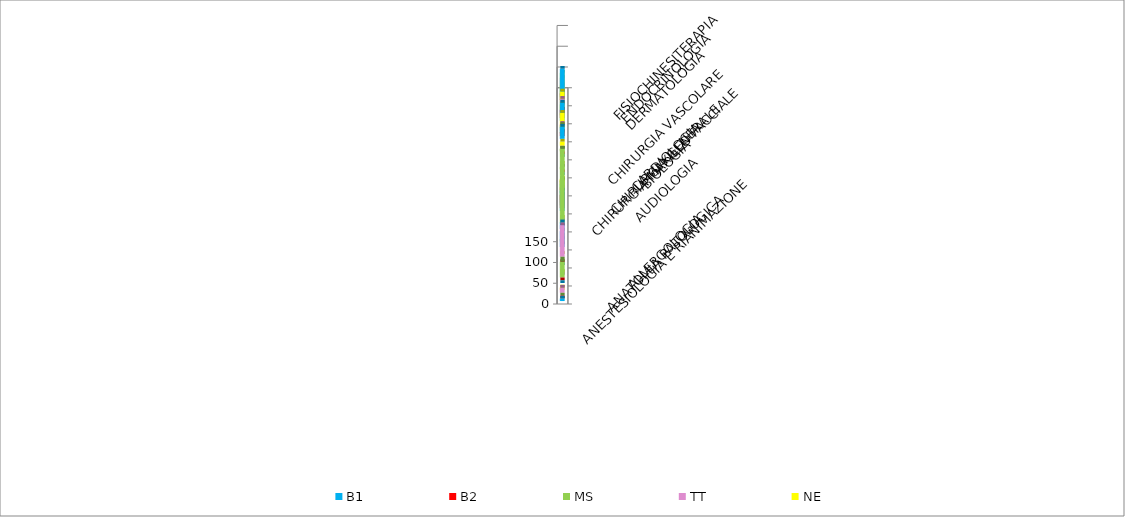
| Category | B1 | B2 | MS | TT | NE |
|---|---|---|---|---|---|
| ALLERGOLOGIA | 6 | 0 | 0 | 12 | 6 |
| ANATOMIA PATOLOGICA | 0 | 0 | 38 | 0 | 0 |
| ANESTESIOLOGIA E RIANIMAZIONE | 0 | 0 | 0 | 76 | 0 |
| AUDIOLOGIA | 38 | 0 | 6 | 0 | 0 |
| BIOLOGIA | 16 | 0 | 190 | 0 | 0 |
| CARDIOLOGIA | 49 | 32 | 60 | 35 | 51 |
| CHIRURGIA GENERALE | 21 | 7 | 16.5 | 12 | 6 |
| CHIRURGIA MAXILLO FACCIALE | 0 | 0 | 6 | 0 | 0 |
| CHIRURGIA VASCOLARE | 0 | 0 | 6 | 0 | 10 |
| DERMATOLOGIA | 29 | 10 | 20 | 16 | 36 |
| ENDOCRINOLOGIA | 44 | 20 | 26 | 33 | 44 |
| FISIOCHINESITERAPIA | 82 | 16 | 59 | 40 | 16 |